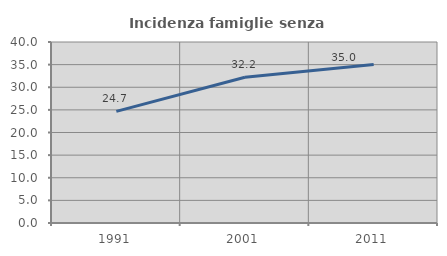
| Category | Incidenza famiglie senza nuclei |
|---|---|
| 1991.0 | 24.674 |
| 2001.0 | 32.203 |
| 2011.0 | 35.024 |